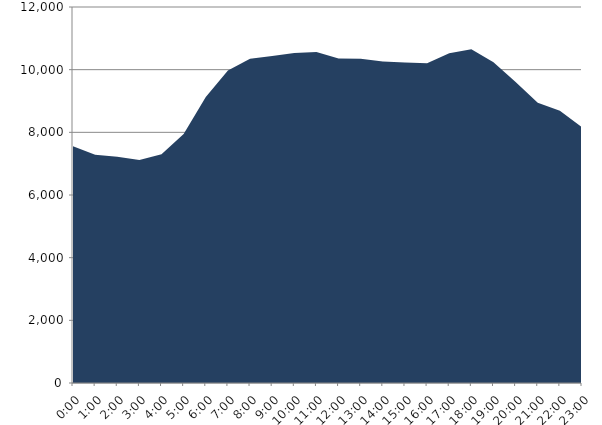
| Category | Series 0 | Series 1 |
|---|---|---|
| 2020-02-19 |  | 7552.822 |
| 2020-02-19 01:00:00 |  | 7286.284 |
| 2020-02-19 02:00:00 |  | 7221.076 |
| 2020-02-19 03:00:00 |  | 7119.471 |
| 2020-02-19 04:00:00 |  | 7298.897 |
| 2020-02-19 05:00:00 |  | 7948.488 |
| 2020-02-19 06:00:00 |  | 9127.015 |
| 2020-02-19 07:00:00 |  | 9972.253 |
| 2020-02-19 08:00:00 |  | 10351.504 |
| 2020-02-19 09:00:00 |  | 10432.409 |
| 2020-02-19 10:00:00 |  | 10534.923 |
| 2020-02-19 11:00:00 |  | 10563.57 |
| 2020-02-19 12:00:00 |  | 10355.202 |
| 2020-02-19 13:00:00 |  | 10349.602 |
| 2020-02-19 14:00:00 |  | 10257.692 |
| 2020-02-19 15:00:00 |  | 10226.855 |
| 2020-02-19 16:00:00 |  | 10207.261 |
| 2020-02-19 17:00:00 |  | 10521.132 |
| 2020-02-19 18:00:00 |  | 10648.215 |
| 2020-02-19 19:00:00 |  | 10236.743 |
| 2020-02-19 20:00:00 |  | 9604.699 |
| 2020-02-19 21:00:00 |  | 8945.936 |
| 2020-02-19 22:00:00 |  | 8685.001 |
| 2020-02-19 23:00:00 |  | 8160.035 |